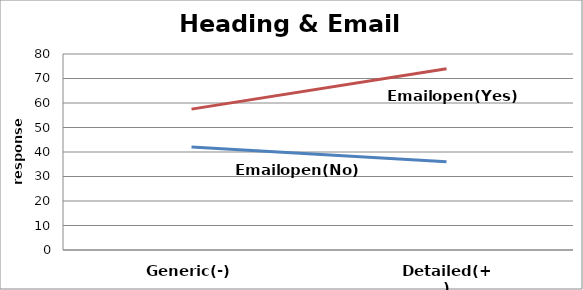
| Category | Series 0 | Series 1 |
|---|---|---|
| Generic(-) | 42 | 57.5 |
| Detailed(+) | 36 | 74 |